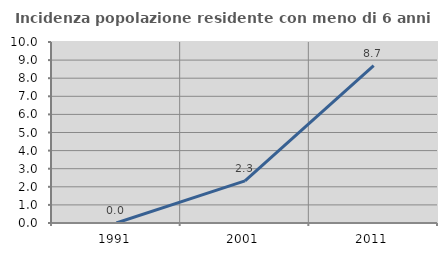
| Category | Incidenza popolazione residente con meno di 6 anni |
|---|---|
| 1991.0 | 0 |
| 2001.0 | 2.326 |
| 2011.0 | 8.696 |